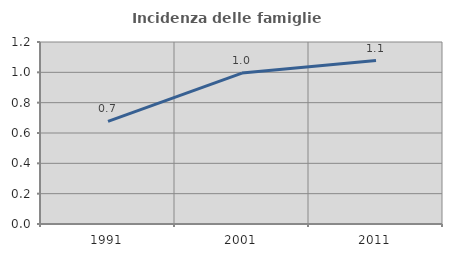
| Category | Incidenza delle famiglie numerose |
|---|---|
| 1991.0 | 0.677 |
| 2001.0 | 0.995 |
| 2011.0 | 1.077 |